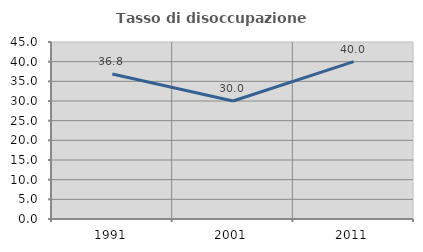
| Category | Tasso di disoccupazione giovanile  |
|---|---|
| 1991.0 | 36.842 |
| 2001.0 | 30 |
| 2011.0 | 40 |